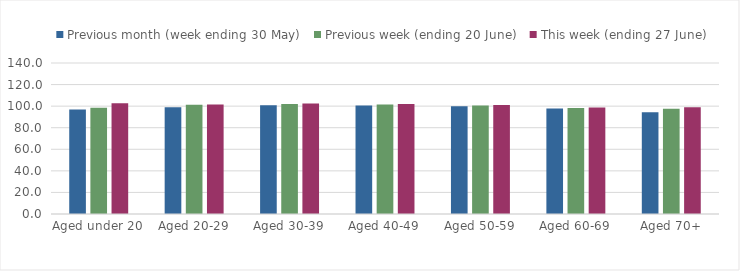
| Category | Previous month (week ending 30 May) | Previous week (ending 20 June) | This week (ending 27 June) |
|---|---|---|---|
| Aged under 20 | 96.951 | 98.528 | 102.723 |
| Aged 20-29 | 98.983 | 101.179 | 101.424 |
| Aged 30-39 | 100.824 | 101.92 | 102.415 |
| Aged 40-49 | 100.702 | 101.566 | 102.055 |
| Aged 50-59 | 99.898 | 100.657 | 101.034 |
| Aged 60-69 | 97.787 | 98.208 | 98.788 |
| Aged 70+ | 94.371 | 97.517 | 98.887 |